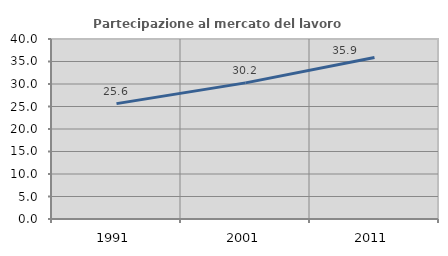
| Category | Partecipazione al mercato del lavoro  femminile |
|---|---|
| 1991.0 | 25.637 |
| 2001.0 | 30.249 |
| 2011.0 | 35.908 |